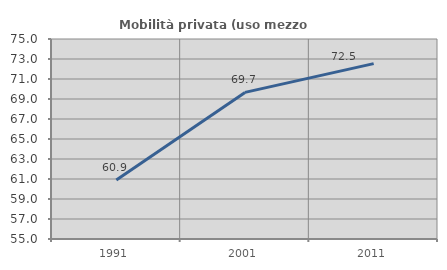
| Category | Mobilità privata (uso mezzo privato) |
|---|---|
| 1991.0 | 60.9 |
| 2001.0 | 69.659 |
| 2011.0 | 72.534 |